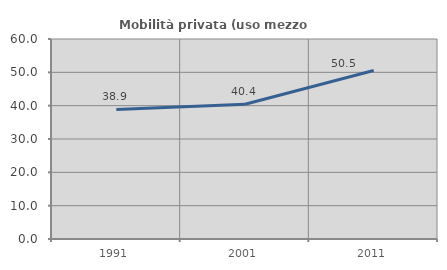
| Category | Mobilità privata (uso mezzo privato) |
|---|---|
| 1991.0 | 38.868 |
| 2001.0 | 40.407 |
| 2011.0 | 50.545 |